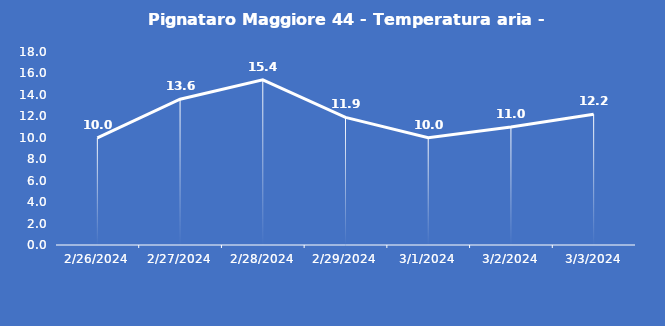
| Category | Pignataro Maggiore 44 - Temperatura aria - Grezzo (°C) |
|---|---|
| 2/26/24 | 10 |
| 2/27/24 | 13.6 |
| 2/28/24 | 15.4 |
| 2/29/24 | 11.9 |
| 3/1/24 | 10 |
| 3/2/24 | 11 |
| 3/3/24 | 12.2 |